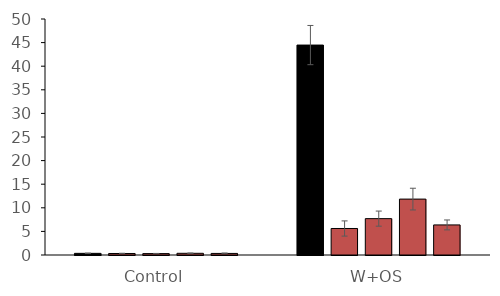
| Category | WT | 707-2 | 698-7 | 649-5 | 626-1 |
|---|---|---|---|---|---|
| Control | 0.348 | 0.319 | 0.296 | 0.361 | 0.334 |
| W+OS | 44.476 | 5.615 | 7.707 | 11.843 | 6.372 |